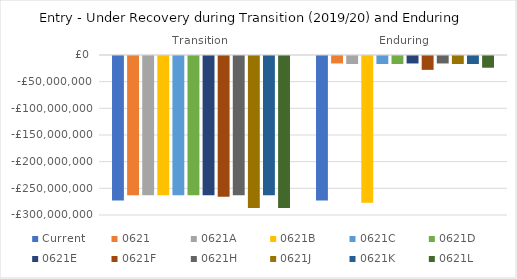
| Category | Current | 0621 | 0621A | 0621B | 0621C | 0621D | 0621E | 0621F | 0621H | 0621J | 0621K | 0621L |
|---|---|---|---|---|---|---|---|---|---|---|---|---|
| Transition | -271000000 | -261000000 | -261000000 | -261000000 | -261000000 | -261000000 | -261000000 | -264000000 | -261000000 | -285000000 | -261000000 | -285000000 |
| Enduring | -271000000 | -14000000 | -15000000 | -275000000 | -15000000 | -15000000 | -14000000 | -26000000 | -14000000 | -15000000 | -15000000 | -22000000 |